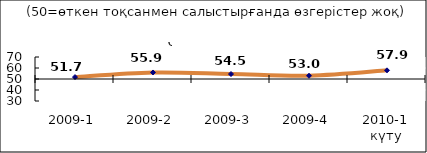
| Category | Диф.индекс ↓ |
|---|---|
| 2009-1 | 51.745 |
| 2009-2 | 55.93 |
| 2009-3 | 54.535 |
| 2009-4 | 52.96 |
| 2010-1 күту | 57.87 |